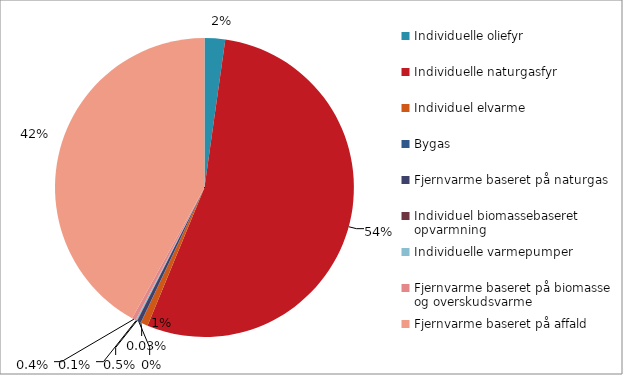
| Category | Series 0 |
|---|---|
| Individuelle oliefyr | 12874.98 |
| Individuelle naturgasfyr | 312444 |
| Individuel elvarme | 4406.79 |
| Bygas | 145.02 |
| Fjernvarme baseret på naturgas | 2476.65 |
| Individuel biomassebaseret opvarmning | 250.12 |
| Individuelle varmepumper | 774 |
| Fjernvarme baseret på biomasse og overskudsvarme | 2476.65 |
| Fjernvarme baseret på affald | 242711.7 |